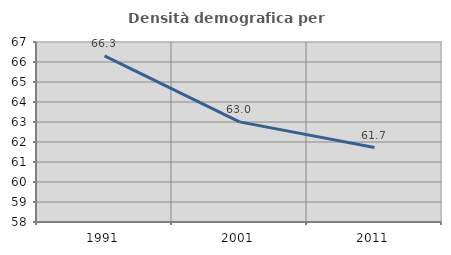
| Category | Densità demografica |
|---|---|
| 1991.0 | 66.304 |
| 2001.0 | 63.007 |
| 2011.0 | 61.725 |